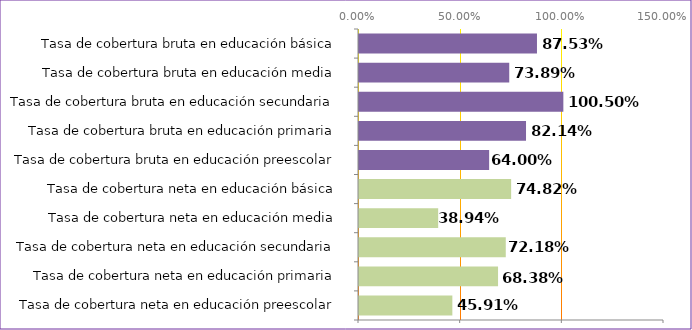
| Category | Series 0 |
|---|---|
| Tasa de cobertura neta en educación preescolar | 0.459 |
| Tasa de cobertura neta en educación primaria | 0.684 |
| Tasa de cobertura neta en educación secundaria | 0.722 |
| Tasa de cobertura neta en educación media | 0.389 |
| Tasa de cobertura neta en educación básica | 0.748 |
| Tasa de cobertura bruta en educación preescolar | 0.64 |
| Tasa de cobertura bruta en educación primaria | 0.821 |
| Tasa de cobertura bruta en educación secundaria | 1.005 |
| Tasa de cobertura bruta en educación media | 0.739 |
| Tasa de cobertura bruta en educación básica | 0.875 |